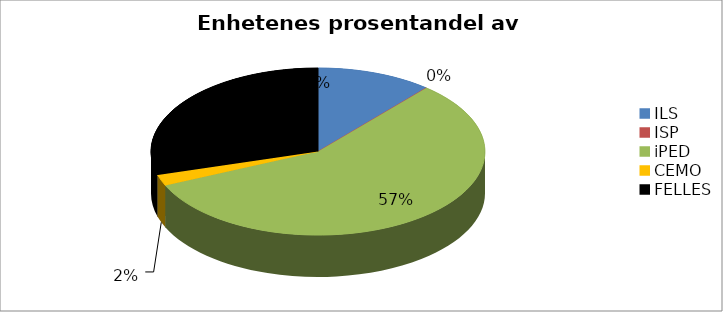
| Category | Series 0 |
|---|---|
| ILS | 2250000 |
| ISP | 0 |
| iPED | 11453785 |
| CEMO | 430000 |
| FELLES | 5925000 |